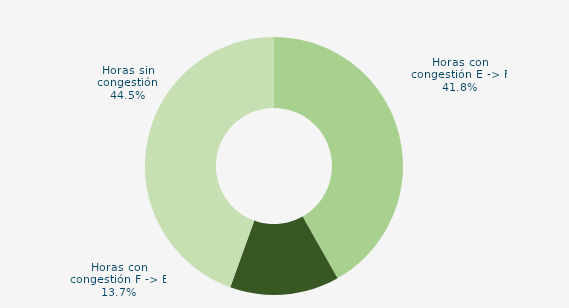
| Category | Horas con congestión E -> F |
|---|---|
| Horas con congestión E -> F | 41.801 |
| Horas con congestión F -> E | 13.71 |
| Horas sin congestión | 44.489 |